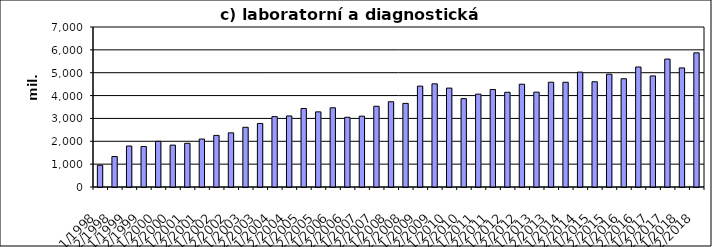
| Category | Series 0 |
|---|---|
| 1/1998 | 951360.606 |
| 2/1998 | 1333513.676 |
| 1/1999 | 1792866.364 |
| 2/1999 | 1771693.636 |
| 1/2000 | 1999193.021 |
| 2/2000 | 1833052.199 |
| 1/2001 | 1911565.425 |
| 2/2001 | 2098621.164 |
| 1/2002 | 2258487 |
| 2/2002 | 2368869 |
| 1/2003 | 2612247 |
| 2/2003 | 2780674.102 |
| 1/2004 | 3077868.032 |
| 2/2004 | 3108307.987 |
| 1/2005 | 3434597 |
| 2/2005 | 3286831.432 |
| 1/2006 | 3465413 |
| 2/2006 | 3050445 |
| 1/2007 | 3098816 |
| 2/2007 | 3532812 |
| 1/2008 | 3729701 |
| 2/2008 | 3657618 |
| 1/2009 | 4413940 |
| 2/2009 | 4513136 |
| 1/2010 | 4326547 |
| 2/2010 | 3866944 |
| 1/2011 | 4063135 |
| 2/2011 | 4265403 |
| 1/2012 | 4143662 |
| 2/2012 | 4497329 |
| 1/2013 | 4149870 |
| 2/2013 | 4583988 |
| 1/2014 | 4582363 |
| 2/2014 | 5026231 |
| 1/2015 | 4604082 |
| 2/2015 | 4936113 |
| 1/2016 | 4736350 |
| 2/2016 | 5249339 |
| 1/2017 | 4859109 |
| 2/2017 | 5595234 |
| 1/2018 | 5209511.578 |
| 2/2018 | 5869201.735 |